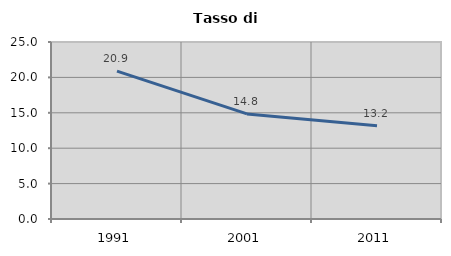
| Category | Tasso di disoccupazione   |
|---|---|
| 1991.0 | 20.892 |
| 2001.0 | 14.84 |
| 2011.0 | 13.161 |